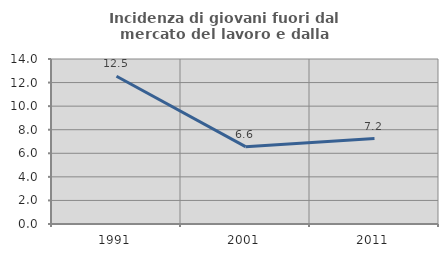
| Category | Incidenza di giovani fuori dal mercato del lavoro e dalla formazione  |
|---|---|
| 1991.0 | 12.539 |
| 2001.0 | 6.564 |
| 2011.0 | 7.246 |